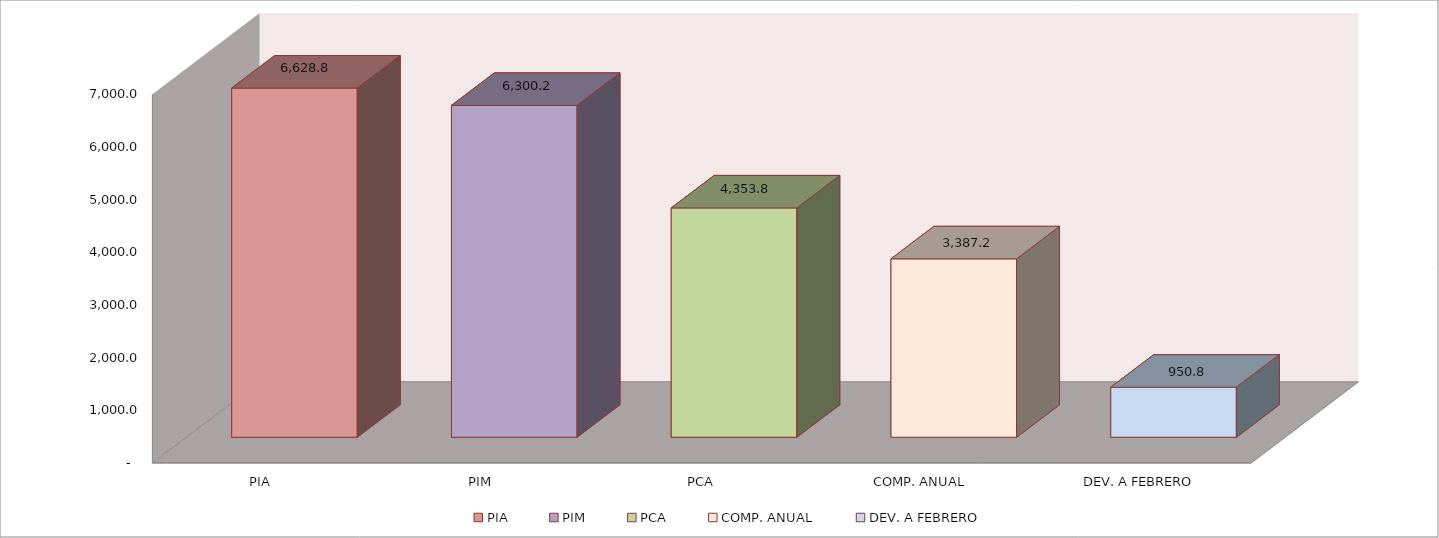
| Category | 011 MINISTERIO DE SALUD |
|---|---|
| PIA | 6628.781 |
| PIM | 6300.224 |
| PCA | 4353.815 |
| COMP. ANUAL | 3387.198 |
| DEV. A FEBRERO | 950.787 |